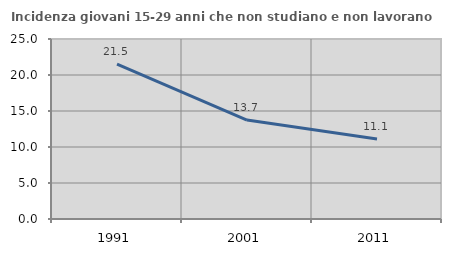
| Category | Incidenza giovani 15-29 anni che non studiano e non lavorano  |
|---|---|
| 1991.0 | 21.498 |
| 2001.0 | 13.74 |
| 2011.0 | 11.111 |